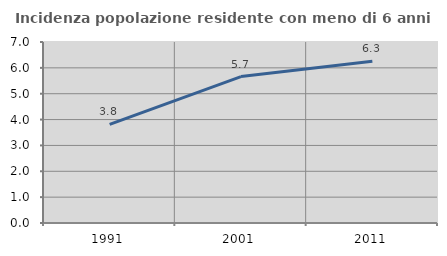
| Category | Incidenza popolazione residente con meno di 6 anni |
|---|---|
| 1991.0 | 3.816 |
| 2001.0 | 5.664 |
| 2011.0 | 6.253 |